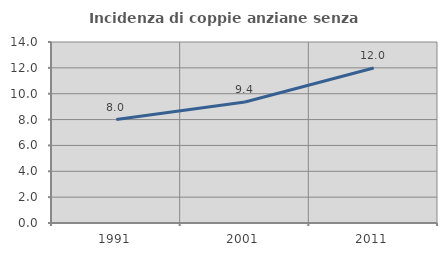
| Category | Incidenza di coppie anziane senza figli  |
|---|---|
| 1991.0 | 8 |
| 2001.0 | 9.355 |
| 2011.0 | 11.987 |